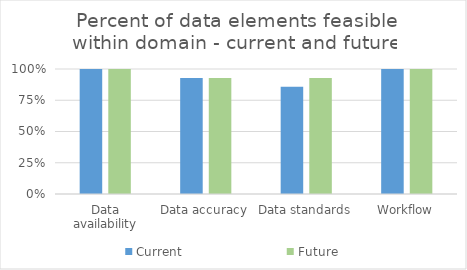
| Category | Current | Future |
|---|---|---|
| Data availability | 1 | 1 |
| Data accuracy | 0.929 | 0.929 |
| Data standards | 0.857 | 0.929 |
| Workflow | 1 | 1 |